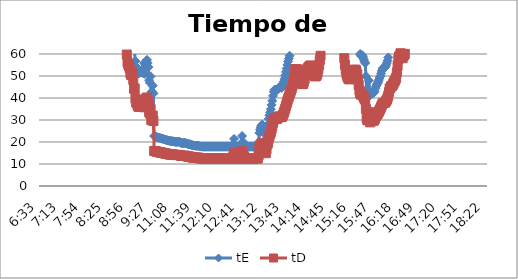
| Category | tE | tD |
|---|---|---|
| 0.27291666666666664 | 17882.69 | 12549.256 |
| 0.2736111111111111 | 17882.69 | 12549.256 |
| 0.2743055555555555 | 17882.69 | 12549.256 |
| 0.275 | 17882.69 | 12549.256 |
| 0.27569444444444446 | 17882.69 | 12549.256 |
| 0.27638888888888885 | 17882.69 | 12549.256 |
| 0.27708333333333335 | 17882.69 | 12549.256 |
| 0.2777777777777778 | 17882.69 | 12549.256 |
| 0.27847222222222223 | 17882.69 | 12549.256 |
| 0.2791666666666667 | 17882.69 | 12549.256 |
| 0.2798611111111111 | 17882.69 | 12549.256 |
| 0.28055555555555556 | 8941.345 | 6274.628 |
| 0.28125 | 8941.345 | 6274.628 |
| 0.28194444444444444 | 8941.345 | 6274.628 |
| 0.2826388888888889 | 8941.345 | 6274.628 |
| 0.2833333333333333 | 8941.345 | 6274.628 |
| 0.28402777777777777 | 8941.345 | 6274.628 |
| 0.2847222222222222 | 8941.345 | 6274.628 |
| 0.28541666666666665 | 8941.345 | 6274.628 |
| 0.28611111111111115 | 5960.897 | 4183.085 |
| 0.2923611111111111 | 4470.672 | 3137.314 |
| 0.29305555555555557 | 3576.538 | 2509.851 |
| 0.29375 | 3576.538 | 2509.851 |
| 0.29444444444444445 | 3576.538 | 2509.851 |
| 0.2951388888888889 | 3576.538 | 2509.851 |
| 0.29583333333333334 | 2980.448 | 2091.543 |
| 0.2972222222222222 | 2980.448 | 2091.543 |
| 0.29791666666666666 | 2554.67 | 1792.751 |
| 0.2986111111111111 | 2554.67 | 1792.751 |
| 0.29930555555555555 | 2235.336 | 1568.657 |
| 0.3 | 2235.336 | 1568.657 |
| 0.30069444444444443 | 2235.336 | 1568.657 |
| 0.3013888888888889 | 1986.966 | 1394.362 |
| 0.3020833333333333 | 1986.966 | 1394.362 |
| 0.30277777777777776 | 1986.966 | 1394.362 |
| 0.3090277777777778 | 1192.179 | 836.617 |
| 0.30972222222222223 | 1117.668 | 784.328 |
| 0.3104166666666667 | 1117.668 | 784.328 |
| 0.3111111111111111 | 1051.923 | 738.192 |
| 0.31180555555555556 | 993.483 | 697.181 |
| 0.3125 | 941.194 | 660.487 |
| 0.31319444444444444 | 941.194 | 660.487 |
| 0.3138888888888889 | 894.134 | 627.463 |
| 0.3145833333333333 | 851.557 | 597.584 |
| 0.31527777777777777 | 812.85 | 570.421 |
| 0.3159722222222222 | 777.508 | 545.62 |
| 0.31666666666666665 | 745.112 | 522.886 |
| 0.31736111111111115 | 715.308 | 501.97 |
| 0.31805555555555554 | 662.322 | 464.787 |
| 0.3201388888888889 | 596.09 | 418.309 |
| 0.32083333333333336 | 576.861 | 404.815 |
| 0.3215277777777778 | 558.834 | 392.164 |
| 0.32222222222222224 | 525.961 | 369.096 |
| 0.3229166666666667 | 496.741 | 348.59 |
| 0.3236111111111111 | 470.597 | 330.244 |
| 0.32430555555555557 | 447.067 | 313.731 |
| 0.325 | 425.778 | 298.792 |
| 0.32569444444444445 | 415.877 | 291.843 |
| 0.3263888888888889 | 397.393 | 278.872 |
| 0.32708333333333334 | 380.483 | 267.005 |
| 0.3277777777777778 | 364.953 | 256.107 |
| 0.3284722222222222 | 343.898 | 241.332 |
| 0.32916666666666666 | 331.161 | 232.394 |
| 0.3298611111111111 | 313.731 | 220.162 |
| 0.33055555555555555 | 303.096 | 212.699 |
| 0.33125 | 288.43 | 202.407 |
| 0.33194444444444443 | 275.118 | 193.065 |
| 0.3326388888888889 | 262.981 | 184.548 |
| 0.3333333333333333 | 251.869 | 176.75 |
| 0.3340277777777778 | 238.436 | 167.323 |
| 0.3347222222222222 | 229.265 | 160.888 |
| 0.3354166666666667 | 220.774 | 154.929 |
| 0.3361111111111111 | 212.889 | 149.396 |
| 0.3368055555555556 | 205.548 | 144.244 |
| 0.3375 | 198.697 | 139.436 |
| 0.33819444444444446 | 190.241 | 133.503 |
| 0.33888888888888885 | 184.358 | 129.374 |
| 0.33958333333333335 | 178.827 | 125.493 |
| 0.34027777777777773 | 173.618 | 121.837 |
| 0.34097222222222223 | 165.58 | 116.197 |
| 0.3416666666666666 | 156.866 | 110.081 |
| 0.3423611111111111 | 150.275 | 105.456 |
| 0.3430555555555555 | 144.215 | 101.204 |
| 0.34375 | 139.709 | 98.041 |
| 0.3444444444444445 | 134.456 | 94.355 |
| 0.3451388888888889 | 130.531 | 91.6 |
| 0.3458333333333334 | 127.733 | 89.638 |
| 0.34652777777777777 | 125.054 | 87.757 |
| 0.34722222222222227 | 123.329 | 86.547 |
| 0.34791666666666665 | 120.018 | 84.223 |
| 0.34861111111111115 | 116.88 | 82.021 |
| 0.34930555555555554 | 115.372 | 80.963 |
| 0.35 | 113.902 | 79.932 |
| 0.3506944444444444 | 111.767 | 78.433 |
| 0.3513888888888889 | 113.182 | 79.426 |
| 0.3520833333333333 | 113.182 | 79.426 |
| 0.3527777777777778 | 111.073 | 77.946 |
| 0.3534722222222222 | 109.041 | 76.52 |
| 0.3541666666666667 | 109.71 | 76.989 |
| 0.3548611111111111 | 112.47 | 78.926 |
| 0.35555555555555557 | 113.182 | 79.426 |
| 0.35625 | 112.47 | 78.926 |
| 0.35694444444444445 | 110.387 | 77.465 |
| 0.3576388888888889 | 107.082 | 75.145 |
| 0.35833333333333334 | 105.815 | 74.256 |
| 0.3590277777777778 | 103.969 | 72.961 |
| 0.3597222222222222 | 102.774 | 72.122 |
| 0.36041666666666666 | 102.774 | 72.122 |
| 0.3611111111111111 | 101.032 | 70.9 |
| 0.36180555555555555 | 97.189 | 68.202 |
| 0.3625 | 96.143 | 67.469 |
| 0.36319444444444443 | 93.627 | 65.703 |
| 0.3638888888888889 | 92.179 | 64.687 |
| 0.3645833333333333 | 90.775 | 63.702 |
| 0.3652777777777778 | 91.706 | 64.355 |
| 0.3659722222222222 | 91.706 | 64.355 |
| 0.3666666666666667 | 90.317 | 63.38 |
| 0.3673611111111111 | 88.528 | 62.125 |
| 0.3680555555555556 | 87.233 | 61.216 |
| 0.36875 | 86.39 | 60.624 |
| 0.36944444444444446 | 85.156 | 59.758 |
| 0.37013888888888885 | 80.191 | 56.275 |
| 0.37083333333333335 | 78.778 | 55.283 |
| 0.37152777777777773 | 77.751 | 54.562 |
| 0.37222222222222223 | 76.097 | 53.401 |
| 0.3729166666666666 | 72.991 | 51.221 |
| 0.3736111111111111 | 71.818 | 50.399 |
| 0.3743055555555555 | 73.29 | 51.431 |
| 0.375 | 72.4 | 50.807 |
| 0.3756944444444445 | 68.78 | 48.266 |
| 0.3763888888888889 | 62.967 | 44.188 |
| 0.3770833333333334 | 63.19 | 44.344 |
| 0.37777777777777777 | 56.77 | 39.839 |
| 0.37847222222222227 | 54.19 | 38.028 |
| 0.37916666666666665 | 53.864 | 37.799 |
| 0.37986111111111115 | 52.136 | 36.587 |
| 0.38055555555555554 | 51.387 | 36.061 |
| 0.38125 | 51.24 | 35.958 |
| 0.3819444444444444 | 52.136 | 36.587 |
| 0.3826388888888889 | 52.442 | 36.801 |
| 0.3833333333333333 | 51.535 | 36.165 |
| 0.3840277777777778 | 52.442 | 36.801 |
| 0.3847222222222222 | 51.535 | 36.165 |
| 0.3854166666666667 | 51.24 | 35.958 |
| 0.3861111111111111 | 55.883 | 39.216 |
| 0.38680555555555557 | 50.948 | 35.753 |
| 0.3875 | 55.024 | 38.613 |
| 0.38819444444444445 | 56.77 | 39.839 |
| 0.3888888888888889 | 57.316 | 40.222 |
| 0.38958333333333334 | 55.883 | 39.216 |
| 0.3902777777777778 | 54.026 | 37.913 |
| 0.3909722222222222 | 48.072 | 33.735 |
| 0.39166666666666666 | 46.936 | 32.938 |
| 0.3923611111111111 | 49.813 | 34.956 |
| 0.39305555555555555 | 42.679 | 29.95 |
| 0.39375 | 42.884 | 30.094 |
| 0.39444444444444443 | 45.619 | 32.013 |
| 0.3951388888888889 | 42.077 | 29.528 |
| 0.4444444444444444 | 22.723 | 15.946 |
| 0.4451388888888889 | 22.608 | 15.865 |
| 0.4458333333333333 | 22.522 | 15.805 |
| 0.4465277777777778 | 22.353 | 15.687 |
| 0.4472222222222222 | 22.187 | 15.57 |
| 0.4479166666666667 | 22.05 | 15.474 |
| 0.4486111111111111 | 21.996 | 15.436 |
| 0.44930555555555557 | 21.942 | 15.398 |
| 0.45 | 21.755 | 15.267 |
| 0.45069444444444445 | 21.702 | 15.23 |
| 0.4513888888888889 | 21.65 | 15.193 |
| 0.45208333333333334 | 21.519 | 15.101 |
| 0.4527777777777778 | 21.442 | 15.047 |
| 0.4534722222222222 | 21.365 | 14.993 |
| 0.45416666666666666 | 21.213 | 14.886 |
| 0.4548611111111111 | 21.113 | 14.816 |
| 0.45555555555555555 | 21.014 | 14.746 |
| 0.45625 | 20.915 | 14.677 |
| 0.45694444444444443 | 20.818 | 14.609 |
| 0.4576388888888889 | 20.698 | 14.525 |
| 0.4583333333333333 | 20.602 | 14.458 |
| 0.4590277777777778 | 20.555 | 14.424 |
| 0.4597222222222222 | 20.508 | 14.391 |
| 0.4604166666666667 | 20.437 | 14.342 |
| 0.4611111111111111 | 20.344 | 14.277 |
| 0.4618055555555556 | 20.344 | 14.277 |
| 0.4625 | 20.368 | 14.293 |
| 0.46319444444444446 | 20.275 | 14.228 |
| 0.46388888888888885 | 20.184 | 14.164 |
| 0.46458333333333335 | 20.093 | 14.1 |
| 0.46527777777777773 | 20.025 | 14.053 |
| 0.46597222222222223 | 20.048 | 14.069 |
| 0.4666666666666666 | 20.048 | 14.069 |
| 0.4673611111111111 | 20.116 | 14.116 |
| 0.4680555555555555 | 20.161 | 14.148 |
| 0.46875 | 20.07 | 14.084 |
| 0.4694444444444445 | 19.914 | 13.975 |
| 0.4701388888888889 | 19.673 | 13.806 |
| 0.4708333333333334 | 19.544 | 13.715 |
| 0.47152777777777777 | 19.501 | 13.685 |
| 0.47222222222222227 | 19.523 | 13.7 |
| 0.47291666666666665 | 19.565 | 13.73 |
| 0.47361111111111115 | 19.587 | 13.745 |
| 0.47430555555555554 | 19.523 | 13.7 |
| 0.475 | 19.459 | 13.655 |
| 0.4756944444444444 | 19.375 | 13.596 |
| 0.4763888888888889 | 19.208 | 13.479 |
| 0.4770833333333333 | 19.065 | 13.379 |
| 0.4777777777777778 | 19.004 | 13.336 |
| 0.4784722222222222 | 19.044 | 13.364 |
| 0.4791666666666667 | 18.944 | 13.294 |
| 0.4798611111111111 | 18.745 | 13.154 |
| 0.48055555555555557 | 18.647 | 13.086 |
| 0.48125 | 18.57 | 13.031 |
| 0.48194444444444445 | 18.493 | 12.978 |
| 0.4826388888888889 | 18.398 | 12.911 |
| 0.48333333333333334 | 18.341 | 12.871 |
| 0.4840277777777778 | 18.304 | 12.845 |
| 0.4847222222222222 | 18.322 | 12.858 |
| 0.48541666666666666 | 18.285 | 12.832 |
| 0.4861111111111111 | 18.266 | 12.818 |
| 0.48680555555555555 | 18.322 | 12.858 |
| 0.4875 | 18.266 | 12.818 |
| 0.48819444444444443 | 18.009 | 12.638 |
| 0.4888888888888889 | 17.919 | 12.574 |
| 0.4895833333333333 | 17.955 | 12.6 |
| 0.4902777777777778 | 17.936 | 12.587 |
| 0.4909722222222222 | 17.883 | 12.549 |
| 0.4916666666666667 | 17.883 | 12.549 |
| 0.4923611111111111 | 17.883 | 12.549 |
| 0.4930555555555556 | 17.883 | 12.549 |
| 0.49375 | 17.883 | 12.549 |
| 0.49444444444444446 | 17.883 | 12.549 |
| 0.49513888888888885 | 17.883 | 12.549 |
| 0.49583333333333335 | 17.883 | 12.549 |
| 0.49652777777777773 | 17.883 | 12.549 |
| 0.49722222222222223 | 17.883 | 12.549 |
| 0.4979166666666666 | 17.883 | 12.549 |
| 0.4986111111111111 | 17.883 | 12.549 |
| 0.4993055555555555 | 17.883 | 12.549 |
| 0.5 | 17.883 | 12.549 |
| 0.5006944444444444 | 17.883 | 12.549 |
| 0.5013888888888889 | 17.883 | 12.549 |
| 0.5020833333333333 | 17.883 | 12.549 |
| 0.5027777777777778 | 17.883 | 12.549 |
| 0.5034722222222222 | 17.883 | 12.549 |
| 0.5041666666666667 | 17.883 | 12.549 |
| 0.5048611111111111 | 17.883 | 12.549 |
| 0.5055555555555555 | 17.883 | 12.549 |
| 0.50625 | 17.883 | 12.549 |
| 0.5069444444444444 | 17.883 | 12.549 |
| 0.5076388888888889 | 17.883 | 12.549 |
| 0.5083333333333333 | 17.883 | 12.549 |
| 0.5090277777777777 | 17.883 | 12.549 |
| 0.5097222222222222 | 17.883 | 12.549 |
| 0.5104166666666666 | 17.883 | 12.549 |
| 0.5111111111111112 | 17.883 | 12.549 |
| 0.5118055555555555 | 17.883 | 12.549 |
| 0.5125 | 17.883 | 12.549 |
| 0.5131944444444444 | 17.883 | 12.549 |
| 0.513888888888889 | 17.883 | 12.549 |
| 0.5145833333333333 | 17.883 | 12.549 |
| 0.5152777777777778 | 17.883 | 12.549 |
| 0.5159722222222222 | 17.883 | 12.549 |
| 0.5166666666666667 | 17.883 | 12.549 |
| 0.517361111111111 | 17.883 | 12.549 |
| 0.5180555555555556 | 17.883 | 12.549 |
| 0.51875 | 17.883 | 12.549 |
| 0.5194444444444445 | 17.883 | 12.549 |
| 0.5201388888888888 | 17.883 | 12.549 |
| 0.5208333333333334 | 19.044 | 13.364 |
| 0.5215277777777778 | 21.416 | 15.029 |
| 0.5222222222222223 | 17.883 | 12.549 |
| 0.5229166666666667 | 17.883 | 12.549 |
| 0.5236111111111111 | 17.883 | 12.549 |
| 0.5243055555555556 | 17.883 | 12.549 |
| 0.525 | 17.883 | 12.549 |
| 0.5256944444444445 | 17.883 | 12.549 |
| 0.5263888888888889 | 17.883 | 12.549 |
| 0.5270833333333333 | 17.883 | 12.549 |
| 0.5277777777777778 | 17.883 | 12.549 |
| 0.5284722222222222 | 19.501 | 13.685 |
| 0.5291666666666667 | 22.723 | 15.946 |
| 0.5298611111111111 | 18.1 | 12.702 |
| 0.5305555555555556 | 19.892 | 13.959 |
| 0.53125 | 18.923 | 13.28 |
| 0.5319444444444444 | 17.883 | 12.549 |
| 0.5326388888888889 | 17.883 | 12.549 |
| 0.5333333333333333 | 17.883 | 12.549 |
| 0.5340277777777778 | 17.883 | 12.549 |
| 0.5347222222222222 | 17.883 | 12.549 |
| 0.5354166666666667 | 17.883 | 12.549 |
| 0.5361111111111111 | 17.883 | 12.549 |
| 0.5368055555555555 | 17.883 | 12.549 |
| 0.5375 | 17.883 | 12.549 |
| 0.5381944444444444 | 17.883 | 12.549 |
| 0.5388888888888889 | 17.883 | 12.549 |
| 0.5395833333333333 | 17.883 | 12.549 |
| 0.5402777777777777 | 17.883 | 12.549 |
| 0.5409722222222222 | 17.883 | 12.549 |
| 0.5416666666666666 | 18.082 | 12.689 |
| 0.5423611111111112 | 18.063 | 12.676 |
| 0.5430555555555555 | 17.883 | 12.549 |
| 0.54375 | 17.883 | 12.549 |
| 0.5444444444444444 | 17.883 | 12.549 |
| 0.545138888888889 | 19.826 | 13.913 |
| 0.5458333333333333 | 24.133 | 16.936 |
| 0.5465277777777778 | 25.62 | 17.979 |
| 0.5472222222222222 | 26.691 | 18.73 |
| 0.5479166666666667 | 27.385 | 19.218 |
| 0.548611111111111 | 27.898 | 19.578 |
| 0.5493055555555556 | 27.597 | 19.366 |
| 0.55 | 24.231 | 17.004 |
| 0.5506944444444445 | 25.081 | 17.601 |
| 0.5513888888888888 | 24.33 | 17.074 |
| 0.5520833333333334 | 21.238 | 14.904 |
| 0.5527777777777778 | 23.686 | 16.622 |
| 0.5534722222222223 | 26.851 | 18.843 |
| 0.5541666666666667 | 27.898 | 19.578 |
| 0.5548611111111111 | 30.517 | 21.415 |
| 0.5555555555555556 | 32.163 | 22.571 |
| 0.55625 | 33.488 | 23.5 |
| 0.5569444444444445 | 34.927 | 24.51 |
| 0.5576388888888889 | 36.872 | 25.875 |
| 0.5583333333333333 | 38.707 | 27.163 |
| 0.5590277777777778 | 40.921 | 28.717 |
| 0.5597222222222222 | 42.884 | 30.094 |
| 0.5604166666666667 | 43.723 | 30.683 |
| 0.5611111111111111 | 43.723 | 30.683 |
| 0.5618055555555556 | 43.51 | 30.533 |
| 0.5625 | 43.51 | 30.533 |
| 0.5631944444444444 | 43.723 | 30.683 |
| 0.5638888888888889 | 44.264 | 31.063 |
| 0.5645833333333333 | 44.707 | 31.373 |
| 0.5652777777777778 | 45.045 | 31.61 |
| 0.5659722222222222 | 45.045 | 31.61 |
| 0.5666666666666667 | 44.707 | 31.373 |
| 0.5673611111111111 | 44.595 | 31.295 |
| 0.5680555555555555 | 45.158 | 31.69 |
| 0.56875 | 46.209 | 32.427 |
| 0.5694444444444444 | 47.434 | 33.287 |
| 0.5701388888888889 | 48.727 | 34.194 |
| 0.5708333333333333 | 50.232 | 35.251 |
| 0.5715277777777777 | 51.834 | 36.375 |
| 0.5722222222222222 | 53.381 | 37.46 |
| 0.5729166666666666 | 55.024 | 38.613 |
| 0.5736111111111112 | 56.591 | 39.713 |
| 0.5743055555555555 | 57.873 | 40.612 |
| 0.575 | 59.214 | 41.554 |
| 0.5756944444444444 | 60.619 | 42.54 |
| 0.576388888888889 | 61.878 | 43.423 |
| 0.5770833333333333 | 63.19 | 44.344 |
| 0.5777777777777778 | 65.028 | 45.634 |
| 0.5784722222222222 | 67.482 | 47.356 |
| 0.5791666666666667 | 70.404 | 49.407 |
| 0.579861111111111 | 72.991 | 51.221 |
| 0.5805555555555556 | 74.823 | 52.507 |
| 0.58125 | 75.774 | 53.175 |
| 0.5819444444444445 | 75.774 | 53.175 |
| 0.5826388888888888 | 74.823 | 52.507 |
| 0.5833333333333334 | 73.895 | 51.856 |
| 0.5840277777777778 | 72.694 | 51.013 |
| 0.5847222222222223 | 70.963 | 49.799 |
| 0.5854166666666667 | 69.313 | 48.641 |
| 0.5861111111111111 | 67.482 | 47.356 |
| 0.5868055555555556 | 66.232 | 46.479 |
| 0.5875 | 65.988 | 46.307 |
| 0.5881944444444445 | 66.232 | 46.479 |
| 0.5888888888888889 | 67.737 | 47.535 |
| 0.5895833333333333 | 69.582 | 48.83 |
| 0.5902777777777778 | 72.108 | 50.602 |
| 0.5909722222222222 | 74.202 | 52.072 |
| 0.5916666666666667 | 75.454 | 52.95 |
| 0.5923611111111111 | 76.097 | 53.401 |
| 0.5930555555555556 | 76.75 | 53.859 |
| 0.59375 | 77.081 | 54.092 |
| 0.5944444444444444 | 77.751 | 54.562 |
| 0.5951388888888889 | 78.09 | 54.8 |
| 0.5958333333333333 | 77.751 | 54.562 |
| 0.5965277777777778 | 76.422 | 53.629 |
| 0.5972222222222222 | 74.823 | 52.507 |
| 0.5979166666666667 | 73.29 | 51.431 |
| 0.5986111111111111 | 72.108 | 50.602 |
| 0.5993055555555555 | 71.246 | 49.997 |
| 0.6 | 70.963 | 49.799 |
| 0.6006944444444444 | 71.246 | 49.997 |
| 0.6013888888888889 | 72.108 | 50.602 |
| 0.6020833333333333 | 73.591 | 51.643 |
| 0.6027777777777777 | 75.774 | 53.175 |
| 0.6034722222222222 | 78.433 | 55.041 |
| 0.6041666666666666 | 81.656 | 57.303 |
| 0.6048611111111112 | 84.352 | 59.195 |
| 0.6055555555555555 | 87.233 | 61.216 |
| 0.60625 | 89.863 | 63.062 |
| 0.6069444444444444 | 92.179 | 64.687 |
| 0.607638888888889 | 103.969 | 72.961 |
| 0.6083333333333333 | 96.143 | 67.469 |
| 0.6090277777777778 | 98.799 | 69.333 |
| 0.6097222222222222 | 101.606 | 71.303 |
| 0.6104166666666667 | 104.577 | 73.387 |
| 0.611111111111111 | 108.38 | 76.056 |
| 0.6118055555555556 | 111.767 | 78.433 |
| 0.6125 | 115.372 | 80.963 |
| 0.6131944444444445 | 120.018 | 84.223 |
| 0.6138888888888888 | 125.054 | 87.757 |
| 0.6145833333333334 | 130.531 | 91.6 |
| 0.6152777777777778 | 136.509 | 95.796 |
| 0.6159722222222223 | 140.809 | 98.813 |
| 0.6166666666666667 | 143.062 | 100.394 |
| 0.6173611111111111 | 143.062 | 100.394 |
| 0.6180555555555556 | 140.809 | 98.813 |
| 0.61875 | 136.509 | 95.796 |
| 0.6194444444444445 | 132.464 | 92.957 |
| 0.6201388888888889 | 127.733 | 89.638 |
| 0.6208333333333333 | 123.329 | 86.547 |
| 0.6215277777777778 | 120.018 | 84.223 |
| 0.6222222222222222 | 116.88 | 82.021 |
| 0.6229166666666667 | 113.902 | 79.932 |
| 0.6236111111111111 | 110.387 | 77.465 |
| 0.6243055555555556 | 107.082 | 75.145 |
| 0.625 | 103.368 | 72.539 |
| 0.6256944444444444 | 98.799 | 69.333 |
| 0.6263888888888889 | 93.627 | 65.703 |
| 0.6270833333333333 | 88.092 | 61.819 |
| 0.6277777777777778 | 82.79 | 58.098 |
| 0.6284722222222222 | 78.433 | 55.041 |
| 0.6291666666666667 | 75.137 | 52.728 |
| 0.6298611111111111 | 72.694 | 51.013 |
| 0.6305555555555555 | 71.246 | 49.997 |
| 0.63125 | 70.128 | 49.213 |
| 0.6319444444444444 | 69.313 | 48.641 |
| 0.6326388888888889 | 69.045 | 48.453 |
| 0.6333333333333333 | 69.313 | 48.641 |
| 0.6340277777777777 | 70.404 | 49.407 |
| 0.6347222222222222 | 71.531 | 50.197 |
| 0.6354166666666666 | 72.694 | 51.013 |
| 0.6361111111111112 | 73.591 | 51.643 |
| 0.6368055555555555 | 74.202 | 52.072 |
| 0.6375 | 74.823 | 52.507 |
| 0.6381944444444444 | 75.454 | 52.95 |
| 0.638888888888889 | 75.137 | 52.728 |
| 0.6395833333333333 | 73.895 | 51.856 |
| 0.6402777777777778 | 72.108 | 50.602 |
| 0.6409722222222222 | 68.78 | 48.266 |
| 0.6416666666666667 | 65.265 | 45.8 |
| 0.642361111111111 | 61.878 | 43.423 |
| 0.6430555555555556 | 60.009 | 42.112 |
| 0.64375 | 59.214 | 41.554 |
| 0.6444444444444445 | 59.411 | 41.692 |
| 0.6451388888888888 | 59.411 | 41.692 |
| 0.6458333333333334 | 58.632 | 41.145 |
| 0.6465277777777778 | 57.501 | 40.351 |
| 0.6472222222222223 | 56.591 | 39.713 |
| 0.6479166666666667 | 55.883 | 39.216 |
| 0.6486111111111111 | 49.952 | 35.054 |
| 0.6493055555555556 | 43.938 | 30.834 |
| 0.65 | 42.578 | 29.879 |
| 0.6506944444444445 | 43.405 | 30.459 |
| 0.6513888888888889 | 47.943 | 33.644 |
| 0.6520833333333333 | 42.477 | 29.808 |
| 0.6527777777777778 | 41.204 | 28.915 |
| 0.6534722222222222 | 42.176 | 29.597 |
| 0.6541666666666667 | 42.376 | 29.738 |
| 0.6548611111111111 | 42.477 | 29.808 |
| 0.6555555555555556 | 42.477 | 29.808 |
| 0.65625 | 42.376 | 29.738 |
| 0.6569444444444444 | 42.987 | 30.166 |
| 0.6576388888888889 | 44.264 | 31.063 |
| 0.6583333333333333 | 45.273 | 31.77 |
| 0.6590277777777778 | 45.971 | 32.26 |
| 0.6597222222222222 | 46.57 | 32.68 |
| 0.6604166666666667 | 47.309 | 33.199 |
| 0.6611111111111111 | 48.201 | 33.825 |
| 0.6618055555555555 | 49.128 | 34.476 |
| 0.6625 | 49.952 | 35.054 |
| 0.6631944444444444 | 51.093 | 35.855 |
| 0.6638888888888889 | 52.289 | 36.694 |
| 0.6645833333333333 | 53.222 | 37.349 |
| 0.6652777777777777 | 53.702 | 37.685 |
| 0.6659722222222222 | 53.864 | 37.799 |
| 0.6666666666666666 | 53.864 | 37.799 |
| 0.6673611111111111 | 54.19 | 38.028 |
| 0.6680555555555556 | 55.024 | 38.613 |
| 0.66875 | 55.883 | 39.216 |
| 0.6694444444444444 | 56.951 | 39.966 |
| 0.6701388888888888 | 58.44 | 41.011 |
| 0.6708333333333334 | 60.825 | 42.685 |
| 0.6715277777777778 | 63.19 | 44.344 |
| 0.6722222222222222 | 63.414 | 44.501 |
| 0.6729166666666666 | 64.558 | 45.304 |
| 0.6736111111111112 | 64.792 | 45.468 |
| 0.6743055555555556 | 65.265 | 45.8 |
| 0.675 | 66.232 | 46.479 |
| 0.6756944444444444 | 67.228 | 47.178 |
| 0.6763888888888889 | 67.995 | 47.716 |
| 0.6770833333333334 | 69.045 | 48.453 |
| 0.6777777777777777 | 70.128 | 49.213 |
| 0.6784722222222223 | 73.591 | 51.643 |
| 0.6791666666666667 | 77.751 | 54.562 |
| 0.6798611111111111 | 82.031 | 57.565 |
| 0.6805555555555555 | 83.956 | 58.917 |
| 0.68125 | 83.956 | 58.917 |
| 0.6819444444444445 | 85.974 | 60.333 |
| 0.6826388888888889 | 86.39 | 60.624 |
| 0.6833333333333332 | 85.563 | 60.044 |
| 0.6840277777777778 | 82.79 | 58.098 |
| 0.6847222222222222 | 84.352 | 59.195 |
| 0.6854166666666667 | 84.752 | 59.475 |
| 0.686111111111111 | 85.563 | 60.044 |
| 0.6868055555555556 | 86.39 | 60.624 |
| 0.6875 | 88.528 | 62.125 |
| 0.6881944444444444 | 89.863 | 63.062 |
| 0.688888888888889 | 92.179 | 64.687 |
| 0.6895833333333333 | 94.617 | 66.398 |
| 0.6902777777777778 | 96.663 | 67.834 |
| 0.6909722222222222 | 101.032 | 70.9 |
| 0.6916666666666668 | 111.767 | 78.433 |
| 0.6923611111111111 | 114.633 | 80.444 |
| 0.6930555555555555 | 116.121 | 81.489 |
| 0.69375 | 116.88 | 82.021 |
| 0.6944444444444445 | 120.829 | 84.792 |
| 0.6951388888888889 | 123.329 | 86.547 |
| 0.6958333333333333 | 125.934 | 88.375 |
| 0.6965277777777777 | 125.934 | 88.375 |
| 0.6972222222222223 | 122.484 | 85.954 |
| 0.6979166666666666 | 125.054 | 87.757 |
| 0.6986111111111111 | 129.585 | 90.937 |
| 0.6993055555555556 | 135.475 | 95.07 |
| 0.7 | 141.926 | 99.597 |
| 0.7006944444444444 | 150.275 | 105.456 |
| 0.7013888888888888 | 155.502 | 109.124 |
| 0.7020833333333334 | 161.105 | 113.056 |
| 0.7027777777777778 | 167.128 | 117.283 |
| 0.7034722222222222 | 177.056 | 124.25 |
| 0.7041666666666666 | 196.513 | 137.904 |
| 0.7048611111111112 | 207.938 | 145.922 |
| 0.7055555555555556 | 218.082 | 153.04 |
| 0.70625 | 229.265 | 160.888 |
| 0.7069444444444444 | 244.968 | 171.908 |
| 0.7076388888888889 | 259.169 | 181.873 |
| 0.7083333333333334 | 270.95 | 190.14 |
| 0.7090277777777777 | 279.417 | 196.082 |
| 0.7097222222222223 | 293.159 | 205.726 |
| 0.7104166666666667 | 303.096 | 212.699 |
| 0.7111111111111111 | 313.731 | 220.162 |
| 0.7118055555555555 | 325.14 | 228.168 |
| 0.7125 | 337.409 | 236.778 |
| 0.7131944444444445 | 350.641 | 246.064 |
| 0.7138888888888889 | 364.953 | 256.107 |
| 0.7145833333333332 | 380.483 | 267.005 |
| 0.7152777777777778 | 397.393 | 278.872 |
| 0.7159722222222222 | 425.778 | 298.792 |
| 0.7166666666666667 | 447.067 | 313.731 |
| 0.717361111111111 | 470.597 | 330.244 |
| 0.7180555555555556 | 496.741 | 348.59 |
| 0.71875 | 525.961 | 369.096 |
| 0.7194444444444444 | 541.9 | 380.28 |
| 0.720138888888889 | 576.861 | 404.815 |
| 0.7208333333333333 | 616.644 | 432.733 |
| 0.7215277777777778 | 638.667 | 448.188 |
| 0.7222222222222222 | 687.796 | 482.664 |
| 0.7229166666666668 | 745.112 | 522.886 |
| 0.7236111111111111 | 812.85 | 570.421 |
| 0.7243055555555555 | 851.557 | 597.584 |
| 0.725 | 941.194 | 660.487 |
| 0.7256944444444445 | 993.483 | 697.181 |
| 0.7263888888888889 | 1051.923 | 738.192 |
| 0.7270833333333333 | 1117.668 | 784.328 |
| 0.7277777777777777 | 1117.668 | 784.328 |
| 0.7284722222222223 | 1192.179 | 836.617 |
| 0.7291666666666666 | 1277.335 | 896.375 |
| 0.7298611111111111 | 1277.335 | 896.375 |
| 0.7305555555555556 | 1375.592 | 965.327 |
| 0.73125 | 1375.592 | 965.327 |
| 0.7319444444444444 | 1375.592 | 965.327 |
| 0.7326388888888888 | 1375.592 | 965.327 |
| 0.7333333333333334 | 1490.224 | 1045.771 |
| 0.7340277777777778 | 1490.224 | 1045.771 |
| 0.7347222222222222 | 1490.224 | 1045.771 |
| 0.7354166666666666 | 1625.699 | 1140.841 |
| 0.7361111111111112 | 1625.699 | 1140.841 |
| 0.7368055555555556 | 1625.699 | 1140.841 |
| 0.7375 | 1788.269 | 1254.926 |
| 0.7381944444444444 | 1788.269 | 1254.926 |
| 0.7388888888888889 | 1986.966 | 1394.362 |
| 0.7395833333333334 | 1986.966 | 1394.362 |
| 0.7402777777777777 | 1986.966 | 1394.362 |
| 0.7409722222222223 | 1986.966 | 1394.362 |
| 0.7416666666666667 | 1986.966 | 1394.362 |
| 0.7423611111111111 | 1986.966 | 1394.362 |
| 0.7430555555555555 | 2235.336 | 1568.657 |
| 0.74375 | 2235.336 | 1568.657 |
| 0.7444444444444445 | 2235.336 | 1568.657 |
| 0.7451388888888889 | 2554.67 | 1792.751 |
| 0.7458333333333332 | 2554.67 | 1792.751 |
| 0.7465277777777778 | 2980.448 | 2091.543 |
| 0.7472222222222222 | 2980.448 | 2091.543 |
| 0.7479166666666667 | 3576.538 | 2509.851 |
| 0.748611111111111 | 3576.538 | 2509.851 |
| 0.7493055555555556 | 4470.672 | 3137.314 |
| 0.75 | 4470.672 | 3137.314 |
| 0.7506944444444444 | 4470.672 | 3137.314 |
| 0.751388888888889 | 5960.897 | 4183.085 |
| 0.7520833333333333 | 5960.897 | 4183.085 |
| 0.7527777777777778 | 5960.897 | 4183.085 |
| 0.7534722222222222 | 5960.897 | 4183.085 |
| 0.7541666666666668 | 8941.345 | 6274.628 |
| 0.7548611111111111 | 8941.345 | 6274.628 |
| 0.7555555555555555 | 8941.345 | 6274.628 |
| 0.75625 | 8941.345 | 6274.628 |
| 0.7569444444444445 | 8941.345 | 6274.628 |
| 0.7576388888888889 | 8941.345 | 6274.628 |
| 0.7583333333333333 | 17882.69 | 12549.256 |
| 0.7590277777777777 | 17882.69 | 12549.256 |
| 0.7597222222222223 | 17882.69 | 12549.256 |
| 0.7604166666666666 | 17882.69 | 12549.256 |
| 0.7611111111111111 | 17882.69 | 12549.256 |
| 0.7618055555555556 | 17882.69 | 12549.256 |
| 0.7625 | 17882.69 | 12549.256 |
| 0.7631944444444444 | 17882.69 | 12549.256 |
| 0.7638888888888888 | 17882.69 | 12549.256 |
| 0.7645833333333334 | 17882.69 | 12549.256 |
| 0.7652777777777778 | 17882.69 | 12549.256 |
| 0.7659722222222222 | 17882.69 | 12549.256 |